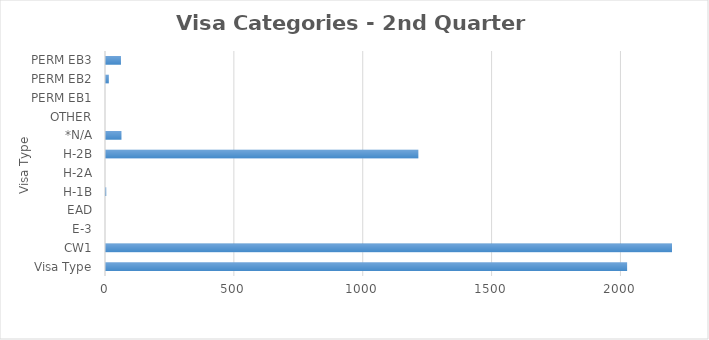
| Category | Series 0 |
|---|---|
| Visa Type | 2022 |
| CW1 | 4796 |
| E-3 | 0 |
| EAD | 0 |
| H-1B | 1 |
| H-2A | 0 |
| H-2B | 1212 |
| *N/A | 60 |
| OTHER | 0 |
| PERM EB1 | 0 |
| PERM EB2 | 11 |
| PERM EB3 | 58 |